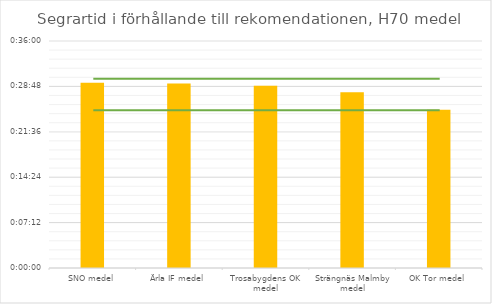
| Category | H70 tid |
|---|---|
| SNO medel | 0.02 |
| Ärla IF medel | 0.02 |
| Trosabygdens OK medel | 0.02 |
| Strängnäs Malmby medel | 0.019 |
| OK Tor medel | 0.017 |